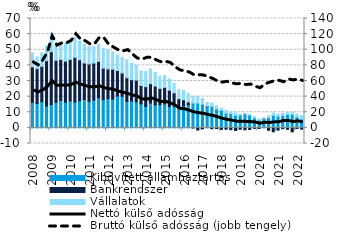
| Category | Kibővített államháztartás | Bankrendszer | Vállalatok |
|---|---|---|---|
| 2008.0 | 16.378 | 22.68 | 8.902 |
| 2008.0 | 15.627 | 22.296 | 7.462 |
| 2008.0 | 16.821 | 22.539 | 8.666 |
| 2008.0 | 14.025 | 28.966 | 9.488 |
| 2009.0 | 14.904 | 33.852 | 11.021 |
| 2009.0 | 16.406 | 26.801 | 10.511 |
| 2009.0 | 17.572 | 26.242 | 10.344 |
| 2009.0 | 16.354 | 26.332 | 11.27 |
| 2010.0 | 17.21 | 26.553 | 11.112 |
| 2010.0 | 16.545 | 28.548 | 12.769 |
| 2010.0 | 17.367 | 26.204 | 11.923 |
| 2010.0 | 18.142 | 23.38 | 12.015 |
| 2011.0 | 16.979 | 23.927 | 11.103 |
| 2011.0 | 17.809 | 23.635 | 10.5 |
| 2011.0 | 19.313 | 23.248 | 10.733 |
| 2011.0 | 18.093 | 20.148 | 12.513 |
| 2012.0 | 18.676 | 19.05 | 11.963 |
| 2012.0 | 18.505 | 19.08 | 11.1 |
| 2012.0 | 20.425 | 16.28 | 9.649 |
| 2012.0 | 20.338 | 14.75 | 9.907 |
| 2013.0 | 16.969 | 15.092 | 11.467 |
| 2013.0 | 17.222 | 13.608 | 10.576 |
| 2013.0 | 16.686 | 13.849 | 9.571 |
| 2013.0 | 15.387 | 11.714 | 9.362 |
| 2014.0 | 13.727 | 12.651 | 9.733 |
| 2014.0 | 15.85 | 12.453 | 9.426 |
| 2014.0 | 14.671 | 12.06 | 8.821 |
| 2014.0 | 14.889 | 10.349 | 7.855 |
| 2015.0 | 15.339 | 10.557 | 7.609 |
| 2015.0 | 13.601 | 10.531 | 7.223 |
| 2015.0 | 14.046 | 8.342 | 6.193 |
| 2015.0 | 12.982 | 5.684 | 5.759 |
| 2016.0 | 14.039 | 3.974 | 5.856 |
| 2016.0 | 14.779 | 1.821 | 5.438 |
| 2016.0 | 15.951 | -0.067 | 4.047 |
| 2016.0 | 15.846 | -1.366 | 4.31 |
| 2017.0 | 15.212 | -0.62 | 3.468 |
| 2017.0 | 13.511 | 0.344 | 2.527 |
| 2017.0 | 13.733 | -0.604 | 2.171 |
| 2017.0 | 12.144 | -0.427 | 1.88 |
| 2018.0 | 11.29 | -0.999 | 1.253 |
| 2018.0 | 9.425 | -0.888 | 1.802 |
| 2018.0 | 9.117 | -1.151 | 1.258 |
| 2018.0 | 8.065 | -1.634 | 1.564 |
| 2019.0 | 8.235 | -0.872 | 0.514 |
| 2019.0 | 8.904 | -1.258 | 0.04 |
| 2019.0 | 8.148 | -1.017 | 0.269 |
| 2019.0 | 6.413 | -0.295 | 0.748 |
| 2020.0 | 5.013 | -0.372 | 0.689 |
| 2020.0 | 5.554 | 0.138 | 0.974 |
| 2020.0 | 6.613 | -1.569 | 1.215 |
| 2020.0 | 8.019 | -2.502 | 1.503 |
| 2021.0 | 7.474 | -1.442 | 1.295 |
| 2021.0 | 7.997 | -0.52 | 1.399 |
| 2021.0 | 8.599 | -0.94 | 1.167 |
| 2021.0 | 8.654 | -2.569 | 1.374 |
| 2022.0 | 7.096 | -0.448 | 1.807 |
| 2022.0 | 5.639 | -0.818 | 2.206 |